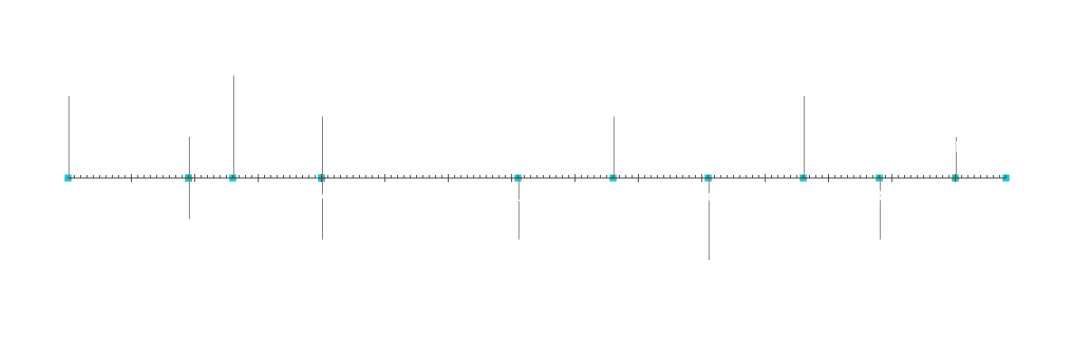
| Category | Позиція |
|---|---|
| Початок проекту | 20 |
| Проміжний етап 1 | 10 |
| Проміжний етап 2 | -10 |
| Проміжний етап 3 | 25 |
| Проміжний етап 4 | -15 |
| Проміжний етап 5 | 15 |
| Проміжний етап 6 | -15 |
| Проміжний етап 7 | 15 |
| Проміжний етап 8 | -20 |
| Проміжний етап 9 | 20 |
| Проміжний етап 10 | -15 |
| Проміжний етап 11 | 10 |
| Кінець проекту | 5 |